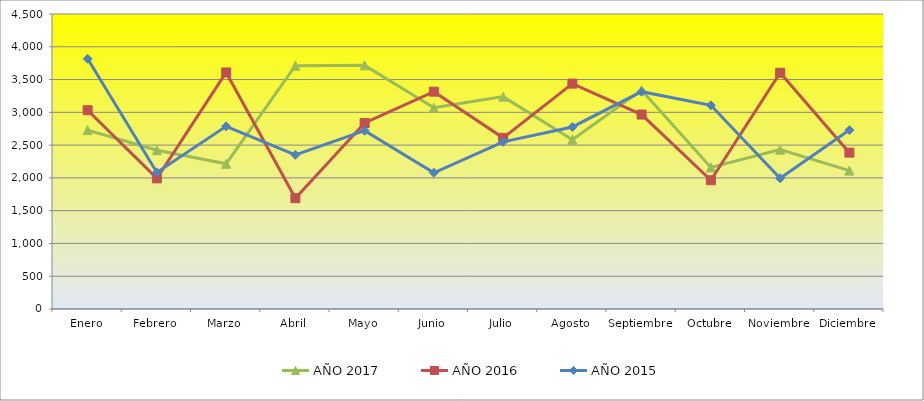
| Category | AÑO 2017 | AÑO 2016 | AÑO 2015 |
|---|---|---|---|
| Enero | 2729.444 | 3032 | 3816 |
| Febrero | 2422.5 | 1993 | 2083 |
| Marzo | 2214.722 | 3608 | 2786 |
| Abril | 3711.667 | 1691 | 2352 |
| Mayo | 3716.389 | 2838 | 2720 |
| Junio | 3069.444 | 3315 | 2078 |
| Julio | 3239.444 | 2611 | 2550 |
| Agosto | 2583.056 | 3438 | 2777 |
| Septiembre | 3338.611 | 2966 | 3315 |
| Octubre | 2159.459 | 1964 | 3107 |
| Noviembre | 2430.541 | 3603 | 1993 |
| Diciembre | 2110.833 | 2385 | 2729 |